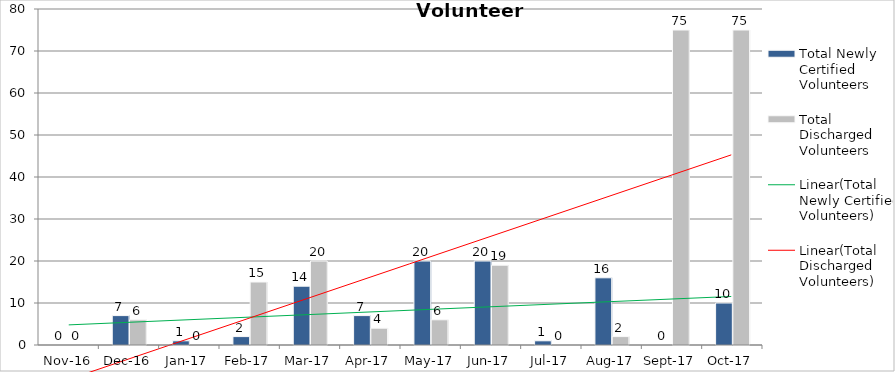
| Category | Total Newly Certified Volunteers | Total Discharged Volunteers |
|---|---|---|
| 2016-11-01 | 0 | 0 |
| 2016-12-01 | 7 | 6 |
| 2017-01-01 | 1 | 0 |
| 2017-02-01 | 2 | 15 |
| 2017-03-01 | 14 | 20 |
| 2017-04-01 | 7 | 4 |
| 2017-05-01 | 20 | 6 |
| 2017-06-01 | 20 | 19 |
| 2017-07-01 | 1 | 0 |
| 2017-08-01 | 16 | 2 |
| 2017-09-01 | 0 | 75 |
| 2017-10-01 | 10 | 75 |